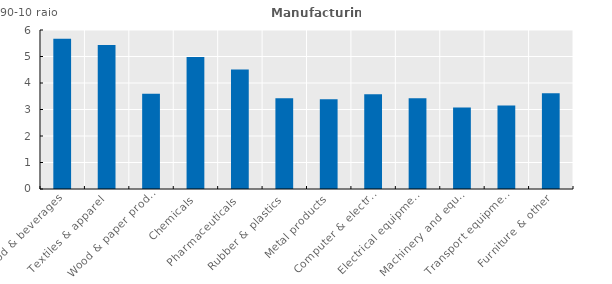
| Category | Series 0 |
|---|---|
| Food & beverages | 5.669 |
| Textiles & apparel  | 5.43 |
| Wood & paper prod.  | 3.592 |
| Chemicals | 4.98 |
| Pharmaceuticals  | 4.51 |
| Rubber & plastics  | 3.426 |
| Metal products | 3.39 |
| Computer & electronics  | 3.574 |
| Electrical equipment | 3.429 |
| Machinery and equipment | 3.077 |
| Transport equipment  | 3.155 |
| Furniture & other | 3.613 |